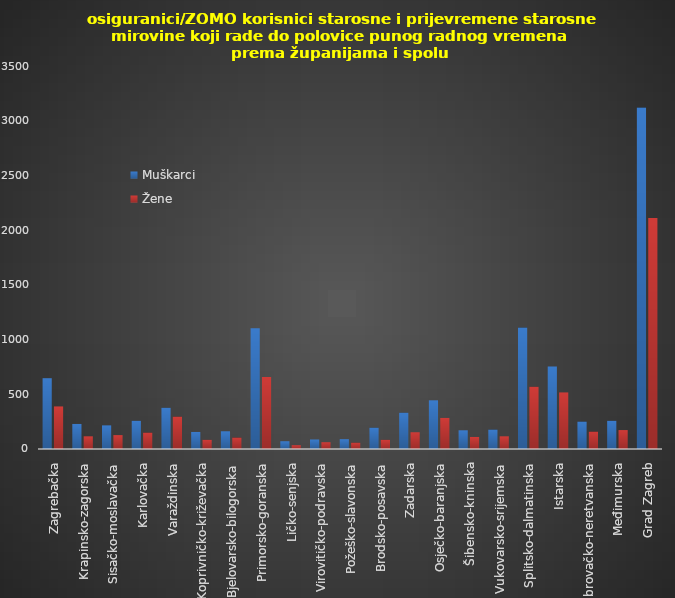
| Category | Muškarci | Žene |
|---|---|---|
| Zagrebačka | 647 | 389 |
| Krapinsko-zagorska | 229 | 116 |
| Sisačko-moslavačka | 216 | 127 |
| Karlovačka | 258 | 150 |
| Varaždinska | 377 | 296 |
| Koprivničko-križevačka | 156 | 84 |
| Bjelovarsko-bilogorska | 162 | 105 |
| Primorsko-goranska | 1104 | 658 |
| Ličko-senjska | 71 | 35 |
| Virovitičko-podravska | 87 | 62 |
| Požeško-slavonska | 90 | 58 |
| Brodsko-posavska | 195 | 84 |
| Zadarska | 332 | 153 |
| Osječko-baranjska | 445 | 284 |
| Šibensko-kninska | 171 | 110 |
| Vukovarsko-srijemska | 178 | 116 |
| Splitsko-dalmatinska | 1110 | 569 |
| Istarska | 754 | 517 |
| Dubrovačko-neretvanska | 251 | 159 |
| Međimurska | 258 | 173 |
| Grad Zagreb | 3120 | 2111 |